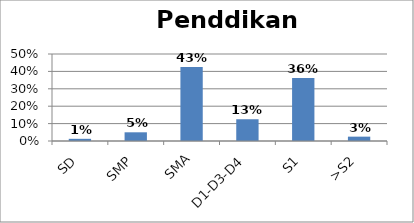
| Category | Penddikan Terakhir |
|---|---|
| SD | 0.012 |
| SMP | 0.05 |
| SMA | 0.425 |
| D1-D3-D4 | 0.125 |
| S1 | 0.362 |
| >S2 | 0.025 |